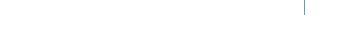
| Category | Series 0 |
|---|---|
| 3.5 | 0 |
| 3.5 | 1 |